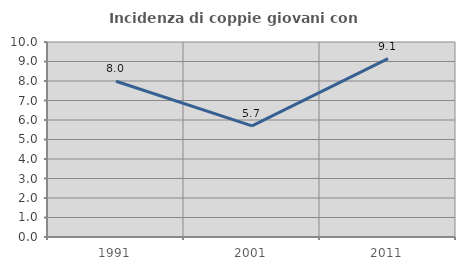
| Category | Incidenza di coppie giovani con figli |
|---|---|
| 1991.0 | 7.989 |
| 2001.0 | 5.696 |
| 2011.0 | 9.143 |